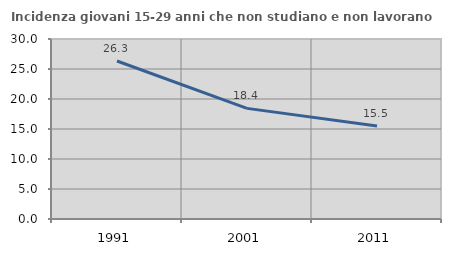
| Category | Incidenza giovani 15-29 anni che non studiano e non lavorano  |
|---|---|
| 1991.0 | 26.337 |
| 2001.0 | 18.438 |
| 2011.0 | 15.498 |